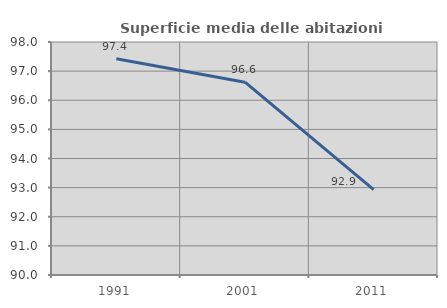
| Category | Superficie media delle abitazioni occupate |
|---|---|
| 1991.0 | 97.427 |
| 2001.0 | 96.621 |
| 2011.0 | 92.933 |